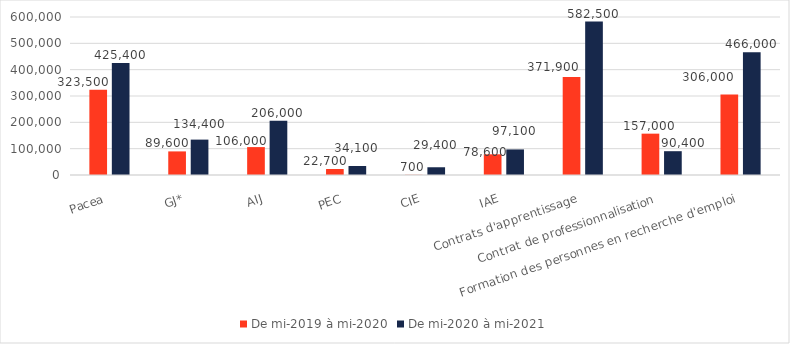
| Category | De mi-2019 à mi-2020 | De mi-2020 à mi-2021 |
|---|---|---|
| Pacea | 323500 | 425400 |
| GJ* | 89600 | 134400 |
| AIJ | 106000 | 206000 |
| PEC | 22700 | 34100 |
| CIE | 700 | 29400 |
| IAE | 78600 | 97100 |
| Contrats d'apprentissage | 371900 | 582500 |
| Contrat de professionnalisation | 157000 | 90400 |
| Formation des personnes en recherche d'emploi | 306000 | 466000 |